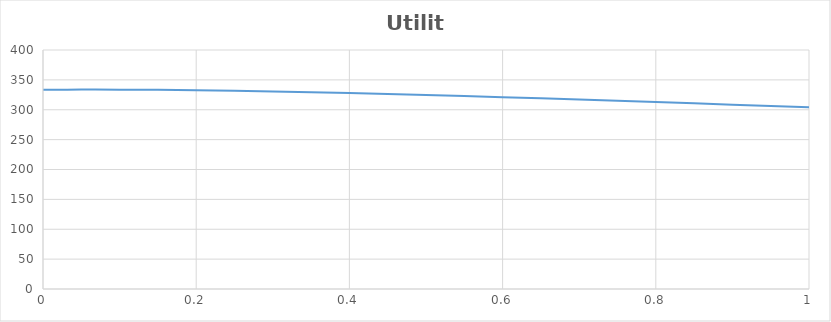
| Category | US Utility |
|---|---|
| 0.0 | 333.363 |
| 0.05 | 333.711 |
| 0.1 | 333.671 |
| 0.15000000000000002 | 333.3 |
| 0.2 | 332.647 |
| 0.25 | 331.752 |
| 0.3 | 330.649 |
| 0.35 | 329.367 |
| 0.39999999999999997 | 327.931 |
| 0.44999999999999996 | 326.362 |
| 0.49999999999999994 | 324.677 |
| 0.5499999999999999 | 322.892 |
| 0.6 | 321.021 |
| 0.65 | 319.075 |
| 0.7000000000000001 | 317.064 |
| 0.7500000000000001 | 314.997 |
| 0.8000000000000002 | 312.881 |
| 0.8500000000000002 | 310.724 |
| 0.9000000000000002 | 308.531 |
| 0.9500000000000003 | 306.307 |
| 1.0000000000000002 | 304.056 |
| 1.0500000000000003 | 301.784 |
| 1.1000000000000003 | 299.492 |
| 1.1500000000000004 | 297.185 |
| 1.2000000000000004 | 294.866 |
| 1.2500000000000004 | 292.535 |
| 1.3000000000000005 | 290.196 |
| 1.3500000000000005 | 287.851 |
| 1.4000000000000006 | 285.501 |
| 1.4500000000000006 | 283.147 |
| 1.5000000000000007 | 280.791 |
| 1.5500000000000007 | 278.434 |
| 1.6000000000000008 | 276.078 |
| 1.6500000000000008 | 273.722 |
| 1.7000000000000008 | 271.368 |
| 1.7500000000000009 | 269.017 |
| 1.800000000000001 | 266.669 |
| 1.850000000000001 | 264.324 |
| 1.900000000000001 | 261.983 |
| 1.950000000000001 | 259.647 |
| 2.000000000000001 | 257.316 |
| 2.0500000000000007 | 254.99 |
| 2.1000000000000005 | 252.669 |
| 2.1500000000000004 | 250.354 |
| 2.2 | 248.045 |
| 2.25 | 245.742 |
| 2.3 | 243.445 |
| 2.3499999999999996 | 241.154 |
| 2.3999999999999995 | 238.869 |
| 2.4499999999999993 | 236.591 |
| 2.499999999999999 | 234.32 |
| 2.549999999999999 | 232.055 |
| 2.5999999999999988 | 229.796 |
| 2.6499999999999986 | 227.544 |
| 2.6999999999999984 | 225.298 |
| 2.7499999999999982 | 223.059 |
| 2.799999999999998 | 220.827 |
| 2.849999999999998 | 218.6 |
| 2.8999999999999977 | 216.381 |
| 2.9499999999999975 | 214.167 |
| 2.9999999999999973 | 211.96 |
| 3.049999999999997 | 209.759 |
| 3.099999999999997 | 207.565 |
| 3.149999999999997 | 205.376 |
| 3.1999999999999966 | 203.194 |
| 3.2499999999999964 | 201.017 |
| 3.2999999999999963 | 198.847 |
| 3.349999999999996 | 196.682 |
| 3.399999999999996 | 194.523 |
| 3.4499999999999957 | 192.37 |
| 3.4999999999999956 | 190.223 |
| 3.5499999999999954 | 188.081 |
| 3.599999999999995 | 185.944 |
| 3.649999999999995 | 183.813 |
| 3.699999999999995 | 181.687 |
| 3.7499999999999947 | 179.567 |
| 3.7999999999999945 | 177.451 |
| 3.8499999999999943 | 175.341 |
| 3.899999999999994 | 173.236 |
| 3.949999999999994 | 171.136 |
| 3.999999999999994 | 169.04 |
| 4.049999999999994 | 166.949 |
| 4.099999999999993 | 164.863 |
| 4.149999999999993 | 162.782 |
| 4.199999999999993 | 160.705 |
| 4.249999999999993 | 158.633 |
| 4.299999999999993 | 156.565 |
| 4.3499999999999925 | 154.501 |
| 4.399999999999992 | 152.442 |
| 4.449999999999992 | 150.386 |
| 4.499999999999992 | 148.335 |
| 4.549999999999992 | 146.288 |
| 4.599999999999992 | 144.245 |
| 4.6499999999999915 | 142.206 |
| 4.699999999999991 | 140.17 |
| 4.749999999999991 | 138.139 |
| 4.799999999999991 | 136.111 |
| 4.849999999999991 | 134.087 |
| 4.899999999999991 | 132.066 |